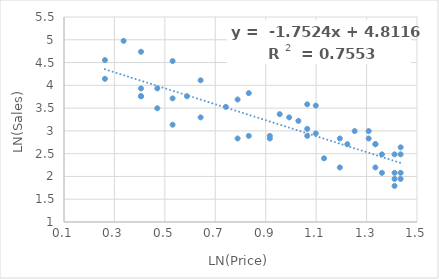
| Category | Natural Log Sales |
|---|---|
| 0.4054651081081644 | 3.761 |
| 1.3609765531356006 | 2.485 |
| 1.33500106673234 | 2.708 |
| 0.6418538861723947 | 3.296 |
| 1.4350845252893227 | 2.079 |
| 1.410986973710262 | 2.485 |
| 0.9932517730102834 | 3.296 |
| 0.7884573603642703 | 2.833 |
| 0.6418538861723947 | 4.111 |
| 1.308332819650179 | 2.996 |
| 0.26236426446749106 | 4.554 |
| 0.47000362924573563 | 3.497 |
| 1.0986122886681098 | 2.944 |
| 1.33500106673234 | 2.708 |
| 0.4054651081081644 | 3.761 |
| 1.1314021114911006 | 2.398 |
| 1.252762968495368 | 2.996 |
| 1.0647107369924282 | 3.584 |
| 1.410986973710262 | 1.946 |
| 1.1939224684724346 | 2.197 |
| 1.0647107369924282 | 3.045 |
| 1.0296194171811581 | 3.219 |
| 0.9555114450274363 | 3.367 |
| 0.8329091229351039 | 2.89 |
| 1.410986973710262 | 1.792 |
| 1.4350845252893227 | 1.946 |
| 1.2237754316221157 | 2.708 |
| 0.5306282510621704 | 3.135 |
| 0.47000362924573563 | 3.932 |
| 0.5306282510621704 | 4.533 |
| 0.4054651081081644 | 3.932 |
| 1.4350845252893227 | 2.639 |
| 0.5306282510621704 | 3.714 |
| 1.3609765531356006 | 2.079 |
| 0.4054651081081644 | 4.736 |
| 1.0986122886681098 | 3.555 |
| 0.9162907318741551 | 2.89 |
| 1.33500106673234 | 2.197 |
| 0.8329091229351039 | 3.829 |
| 0.9162907318741551 | 2.833 |
| 0.5877866649021191 | 3.761 |
| 0.26236426446749106 | 4.143 |
| 1.410986973710262 | 2.079 |
| 0.7419373447293773 | 3.526 |
| 0.3364722366212129 | 4.977 |
| 1.0647107369924282 | 2.89 |
| 0.7884573603642703 | 3.689 |
| 1.1939224684724346 | 2.833 |
| 1.308332819650179 | 2.833 |
| 1.4350845252893227 | 2.485 |